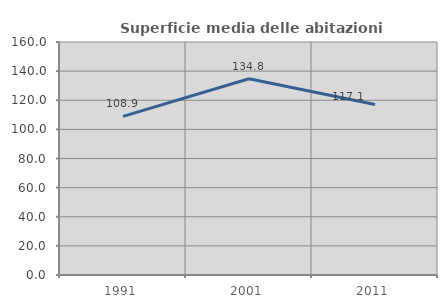
| Category | Superficie media delle abitazioni occupate |
|---|---|
| 1991.0 | 108.943 |
| 2001.0 | 134.797 |
| 2011.0 | 117.06 |